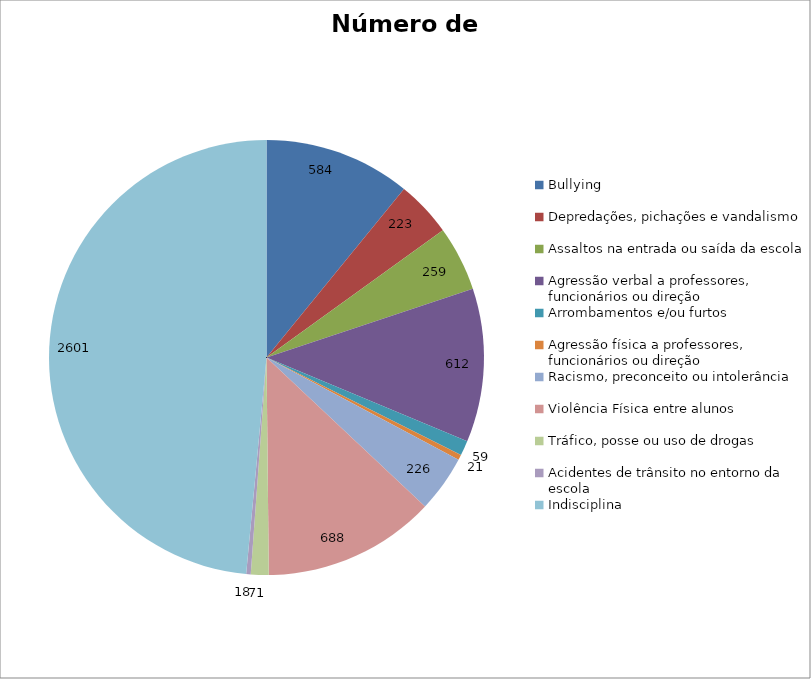
| Category | Número de Casos |
|---|---|
| Bullying | 584 |
| Depredações, pichações e vandalismo | 223 |
| Assaltos na entrada ou saída da escola | 259 |
| Agressão verbal a professores, funcionários ou direção | 612 |
| Arrombamentos e/ou furtos | 59 |
| Agressão física a professores, funcionários ou direção | 21 |
| Racismo, preconceito ou intolerância | 226 |
| Violência Física entre alunos | 688 |
| Tráfico, posse ou uso de drogas | 71 |
| Acidentes de trânsito no entorno da escola | 18 |
| Indisciplina | 2601 |